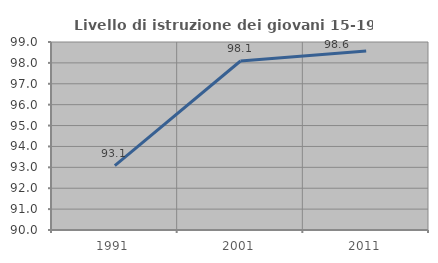
| Category | Livello di istruzione dei giovani 15-19 anni |
|---|---|
| 1991.0 | 93.078 |
| 2001.0 | 98.091 |
| 2011.0 | 98.568 |